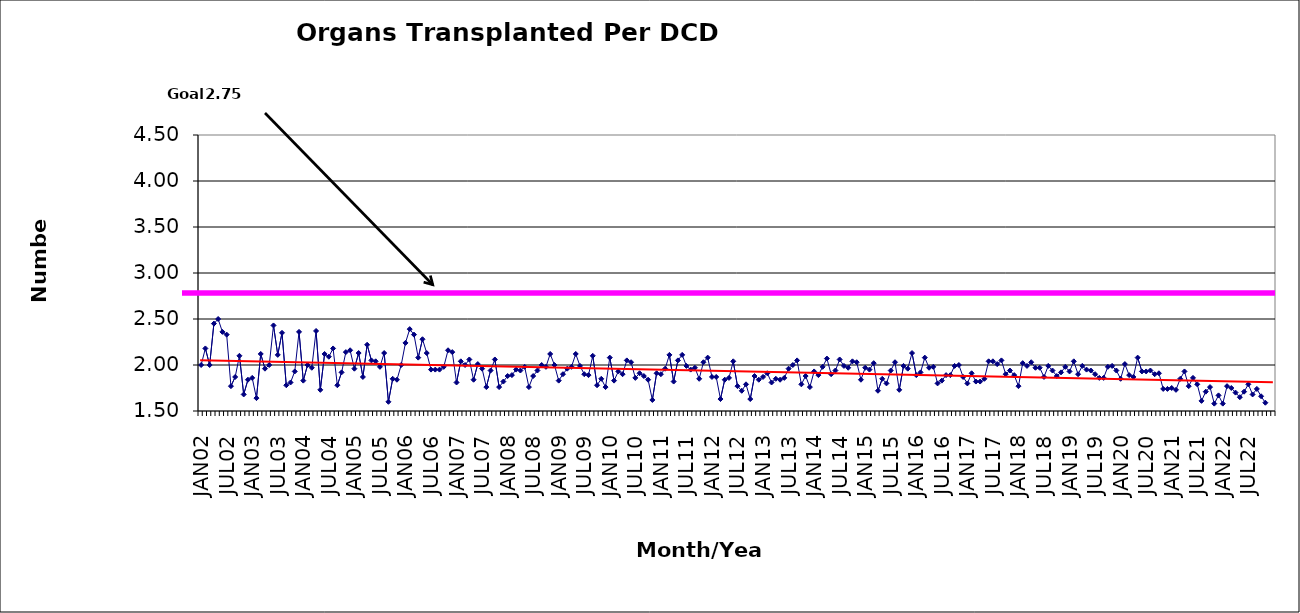
| Category | Series 0 |
|---|---|
| JAN02 | 2 |
| FEB02 | 2.18 |
| MAR02 | 2 |
| APR02 | 2.45 |
| MAY02 | 2.5 |
| JUN02 | 2.36 |
| JUL02 | 2.33 |
| AUG02 | 1.77 |
| SEP02 | 1.87 |
| OCT02 | 2.1 |
| NOV02 | 1.68 |
| DEC02 | 1.84 |
| JAN03 | 1.86 |
| FEB03 | 1.64 |
| MAR03 | 2.12 |
| APR03 | 1.96 |
| MAY03 | 2 |
| JUN03 | 2.43 |
| JUL03 | 2.11 |
| AUG03 | 2.35 |
| SEP03 | 1.78 |
| OCT03 | 1.81 |
| NOV03 | 1.93 |
| DEC03 | 2.36 |
| JAN04 | 1.83 |
| FEB04 | 2 |
| MAR04 | 1.97 |
| APR04 | 2.37 |
| MAY04 | 1.73 |
| JUN04 | 2.12 |
| JUL04 | 2.09 |
| AUG04 | 2.18 |
| SEP04 | 1.78 |
| OCT04 | 1.92 |
| NOV04 | 2.14 |
| DEC04 | 2.16 |
| JAN05 | 1.96 |
| FEB05 | 2.13 |
| MAR05 | 1.87 |
| APR05 | 2.22 |
| MAY05 | 2.05 |
| JUN05 | 2.04 |
| JUL05 | 1.98 |
| AUG05 | 2.13 |
| SEP05 | 1.6 |
| OCT05 | 1.85 |
| NOV05 | 1.84 |
| DEC05 | 2 |
| JAN06 | 2.24 |
| FEB06 | 2.39 |
| MAR06 | 2.33 |
| APR06 | 2.08 |
| MAY06 | 2.28 |
| JUN06 | 2.13 |
| JUL06 | 1.95 |
| AUG06 | 1.95 |
| SEP06 | 1.95 |
| OCT06 | 1.98 |
| NOV06 | 2.16 |
| DEC06 | 2.14 |
| JAN07 | 1.81 |
| FEB07 | 2.04 |
| MAR07 | 2 |
| APR07 | 2.06 |
| MAY07 | 1.84 |
| JUN07 | 2.01 |
| JUL07 | 1.96 |
| AUG07 | 1.76 |
| SEP07 | 1.94 |
| OCT07 | 2.06 |
| NOV07 | 1.76 |
| DEC07 | 1.82 |
| JAN08 | 1.88 |
| FEB08 | 1.89 |
| MAR08 | 1.95 |
| APR08 | 1.94 |
| MAY08 | 1.98 |
| JUN08 | 1.76 |
| JUL08 | 1.88 |
| AUG08 | 1.94 |
| SEP08 | 2 |
| OCT08 | 1.98 |
| NOV08 | 2.12 |
| DEC08 | 2 |
| JAN09 | 1.83 |
| FEB09 | 1.9 |
| MAR09 | 1.96 |
| APR09 | 1.98 |
| MAY09 | 2.12 |
| JUN09 | 1.99 |
| JUL09 | 1.9 |
| AUG09 | 1.89 |
| SEP09 | 2.1 |
| OCT09 | 1.78 |
| NOV09 | 1.85 |
| DEC09 | 1.76 |
| JAN10 | 2.08 |
| FEB10 | 1.83 |
| MAR10 | 1.93 |
| APR10 | 1.9 |
| MAY10 | 2.05 |
| JUN10 | 2.03 |
| JUL10 | 1.86 |
| AUG10 | 1.91 |
| SEP10 | 1.88 |
| OCT10 | 1.84 |
| NOV10 | 1.62 |
| DEC10 | 1.91 |
| JAN11 | 1.9 |
| FEB11 | 1.96 |
| MAR11 | 2.11 |
| APR11 | 1.82 |
| MAY11 | 2.05 |
| JUN11 | 2.11 |
| JUL11 | 1.99 |
| AUG11 | 1.95 |
| SEP11 | 1.97 |
| OCT11 | 1.85 |
| NOV11 | 2.03 |
| DEC11 | 2.08 |
| JAN12 | 1.87 |
| FEB12 | 1.87 |
| MAR12 | 1.63 |
| APR12 | 1.84 |
| MAY12 | 1.86 |
| JUN12 | 2.04 |
| JUL12 | 1.77 |
| AUG12 | 1.72 |
| SEP12 | 1.79 |
| OCT12 | 1.63 |
| NOV12 | 1.88 |
| DEC12 | 1.84 |
| JAN13 | 1.87 |
| FEB13 | 1.91 |
| MAR13 | 1.81 |
| APR13 | 1.85 |
| MAY13 | 1.84 |
| JUN13 | 1.86 |
| JUL13 | 1.96 |
| AUG13 | 2 |
| SEP13 | 2.05 |
| OCT13 | 1.79 |
| NOV13 | 1.88 |
| DEC13 | 1.76 |
| JAN14 | 1.93 |
| FEB14 | 1.89 |
| MAR14 | 1.98 |
| APR14 | 2.07 |
| MAY14 | 1.9 |
| JUN14 | 1.94 |
| JUL14 | 2.06 |
| AUG14 | 1.99 |
| SEP14 | 1.97 |
| OCT14 | 2.04 |
| NOV14 | 2.03 |
| DEC14 | 1.84 |
| JAN15 | 1.97 |
| FEB15 | 1.95 |
| MAR15 | 2.02 |
| APR15 | 1.72 |
| MAY15 | 1.85 |
| JUN15 | 1.8 |
| JUL15 | 1.94 |
| AUG15 | 2.03 |
| SEP15 | 1.73 |
| OCT15 | 1.99 |
| NOV15 | 1.96 |
| DEC15 | 2.13 |
| JAN16 | 1.89 |
| FEB16 | 1.92 |
| MAR16 | 2.08 |
| APR16 | 1.97 |
| MAY16 | 1.98 |
| JUN16 | 1.8 |
| JUL16 | 1.83 |
| AUG16 | 1.89 |
| SEP16 | 1.89 |
| OCT16 | 1.99 |
| NOV16 | 2 |
| DEC16 | 1.87 |
| JAN17 | 1.8 |
| FEB17 | 1.91 |
| MAR17 | 1.82 |
| APR17 | 1.82 |
| MAY17 | 1.85 |
| JUN17 | 2.04 |
| JUL17 | 2.04 |
| AUG17 | 2.01 |
| SEP17 | 2.05 |
| OCT17 | 1.9 |
| NOV17 | 1.94 |
| DEC17 | 1.89 |
| JAN18 | 1.77 |
| FEB18 | 2.02 |
| MAR18 | 1.99 |
| APR18 | 2.03 |
| MAY18 | 1.97 |
| JUN18 | 1.97 |
| JUL18 | 1.87 |
| AUG18 | 1.99 |
| SEP18 | 1.94 |
| OCT18 | 1.88 |
| NOV18 | 1.92 |
| DEC18 | 1.98 |
| JAN19 | 1.93 |
| FEB19 | 2.04 |
| MAR19 | 1.9 |
| APR19 | 1.99 |
| MAY19 | 1.95 |
| JUN19 | 1.94 |
| JUL19 | 1.9 |
| AUG19 | 1.86 |
| SEP19 | 1.86 |
| OCT19 | 1.98 |
| NOV19 | 1.99 |
| DEC19 | 1.94 |
| JAN20 | 1.85 |
| FEB20 | 2.01 |
| MAR20 | 1.89 |
| APR20 | 1.87 |
| MAY20 | 2.08 |
| JUN20 | 1.93 |
| JUL20 | 1.93 |
| AUG20 | 1.94 |
| SEP20 | 1.9 |
| OCT20 | 1.91 |
| NOV20 | 1.74 |
| DEC20 | 1.74 |
| JAN21 | 1.75 |
| FEB21 | 1.73 |
| MAR21 | 1.85 |
| APR21 | 1.93 |
| MAY21 | 1.77 |
| JUN21 | 1.86 |
| JUL21 | 1.79 |
| AUG21 | 1.61 |
| SEP21 | 1.71 |
| OCT21 | 1.76 |
| NOV21 | 1.58 |
| DEC21 | 1.67 |
| JAN22 | 1.58 |
| FEB22 | 1.77 |
| MAR22 | 1.75 |
| APR22 | 1.7 |
| MAY22 | 1.65 |
| JUN22 | 1.71 |
| JUL22 | 1.79 |
| AUG22 | 1.68 |
| SEP22 | 1.74 |
| OCT22 | 1.66 |
| NOV22 | 1.59 |